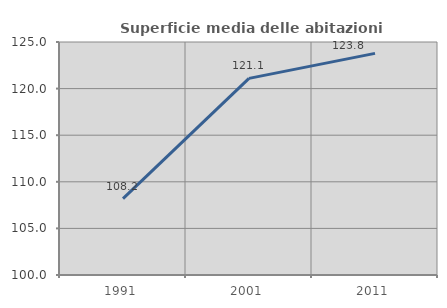
| Category | Superficie media delle abitazioni occupate |
|---|---|
| 1991.0 | 108.192 |
| 2001.0 | 121.097 |
| 2011.0 | 123.782 |